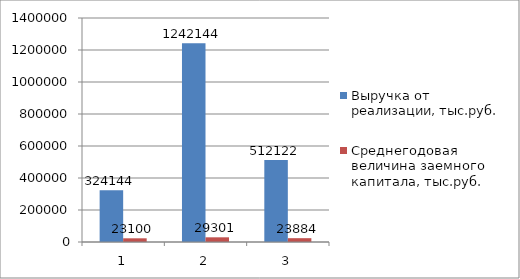
| Category | Выручка от реализации, тыс.руб. | Среднегодовая величина заемного капитала, тыс.руб. |
|---|---|---|
| 0 | 324144 | 23100 |
| 1 | 1242144 | 29301 |
| 2 | 512122 | 23884 |